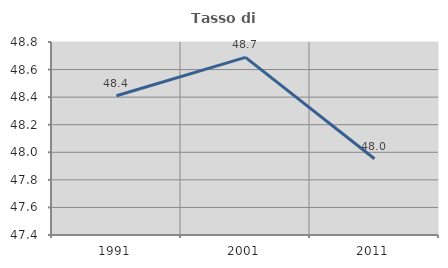
| Category | Tasso di occupazione   |
|---|---|
| 1991.0 | 48.41 |
| 2001.0 | 48.688 |
| 2011.0 | 47.953 |